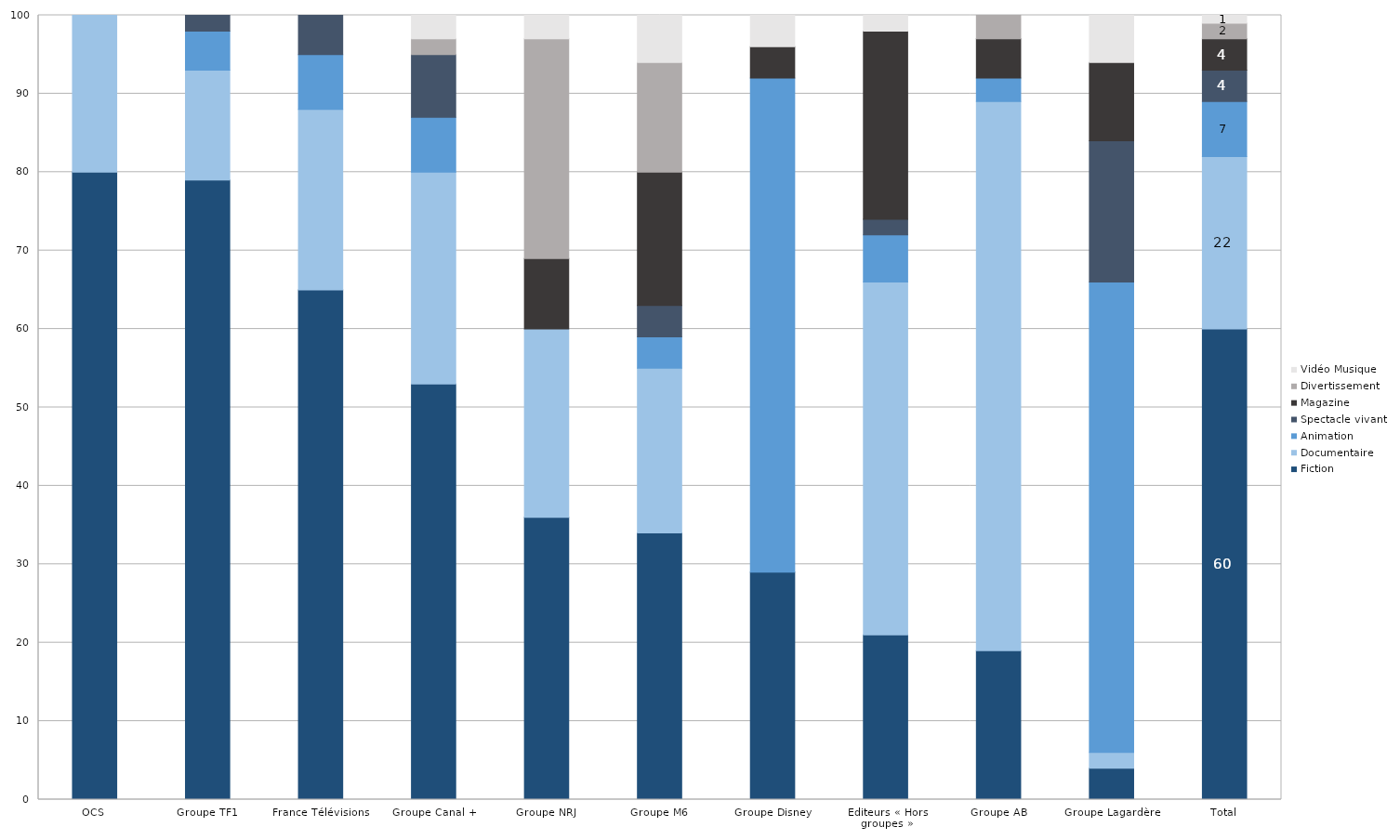
| Category | Fiction | Documentaire | Animation | Spectacle vivant | Magazine | Divertissement | Vidéo Musique |
|---|---|---|---|---|---|---|---|
| OCS | 80 | 20 | 0 | 0 | 0 | 0 | 0 |
| Groupe TF1 | 79 | 14 | 5 | 2 | 0 | 0 | 0 |
| France Télévisions | 65 | 23 | 7 | 5 | 0 | 0 | 0 |
| Groupe Canal + | 53 | 27 | 7 | 8 | 0 | 2 | 3 |
| Groupe NRJ | 36 | 24 | 0 | 0 | 9 | 28 | 3 |
| Groupe M6 | 34 | 21 | 4 | 4 | 17 | 14 | 6 |
| Groupe Disney | 29 | 0 | 63 | 0 | 4 | 0 | 4 |
| Editeurs « Hors groupes » | 21 | 45 | 6 | 2 | 24 | 0 | 2 |
| Groupe AB | 19 | 70 | 3 | 0 | 5 | 3 | 0 |
| Groupe Lagardère | 4 | 2 | 60 | 18 | 10 | 0 | 6 |
| Total | 60 | 22 | 7 | 4 | 4 | 2 | 1 |